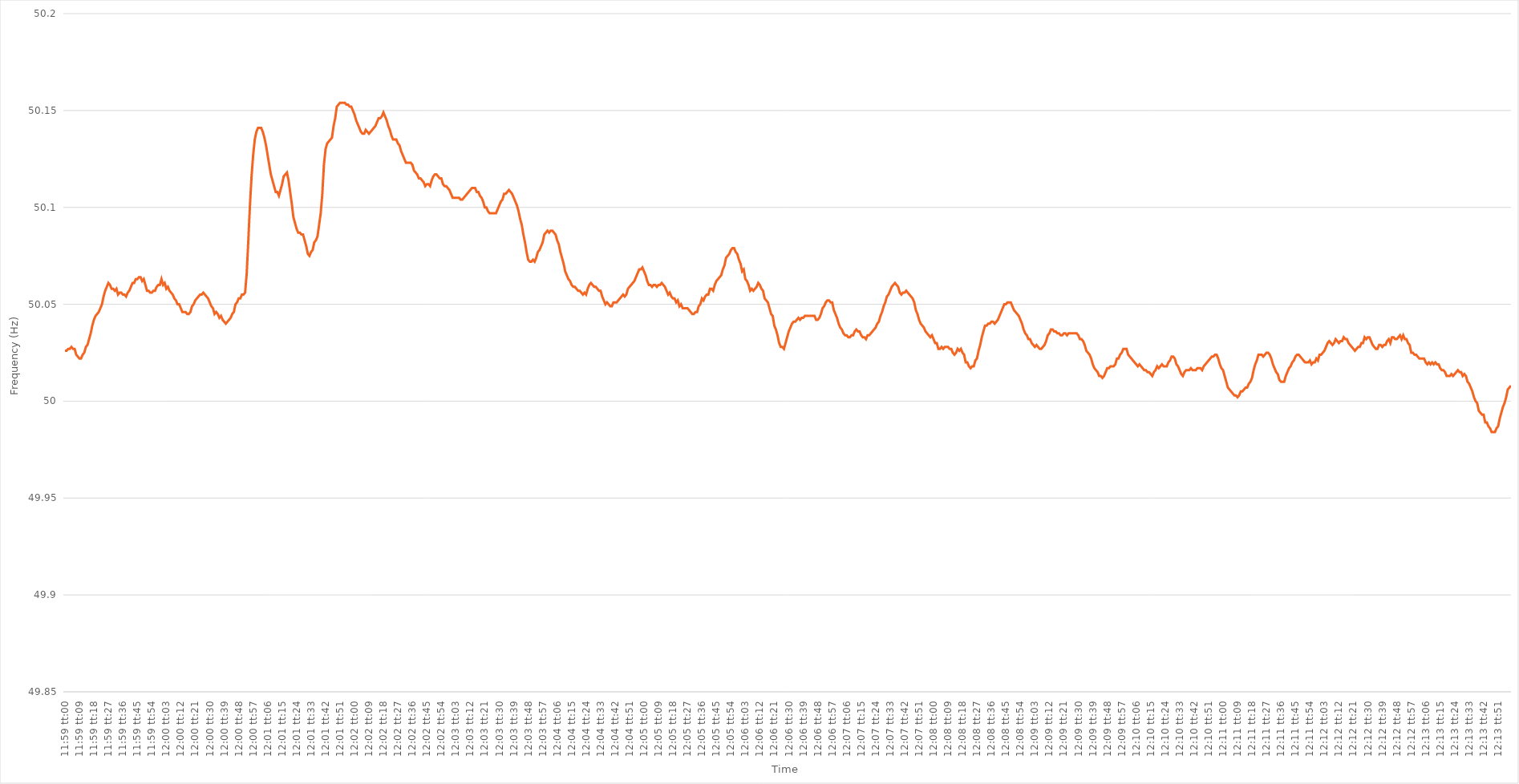
| Category | Series 0 |
|---|---|
| 0.4993055555555555 | 50.026 |
| 0.49931712962962965 | 50.026 |
| 0.4993287037037037 | 50.027 |
| 0.4993402777777778 | 50.027 |
| 0.4993518518518518 | 50.028 |
| 0.4993634259259259 | 50.027 |
| 0.49937499999999996 | 50.027 |
| 0.4993865740740741 | 50.024 |
| 0.49939814814814815 | 50.023 |
| 0.49940972222222224 | 50.022 |
| 0.4994212962962963 | 50.022 |
| 0.4994328703703704 | 50.024 |
| 0.4994444444444444 | 50.025 |
| 0.49945601851851856 | 50.028 |
| 0.4994675925925926 | 50.029 |
| 0.4994791666666667 | 50.032 |
| 0.49949074074074074 | 50.035 |
| 0.49950231481481483 | 50.039 |
| 0.49951388888888887 | 50.042 |
| 0.499525462962963 | 50.044 |
| 0.49953703703703706 | 50.045 |
| 0.4995486111111111 | 50.046 |
| 0.4995601851851852 | 50.048 |
| 0.49957175925925923 | 50.05 |
| 0.4995833333333333 | 50.054 |
| 0.49959490740740736 | 50.057 |
| 0.4996064814814815 | 50.059 |
| 0.49961805555555555 | 50.061 |
| 0.49962962962962965 | 50.06 |
| 0.4996412037037037 | 50.058 |
| 0.4996527777777778 | 50.058 |
| 0.4996643518518518 | 50.057 |
| 0.49967592592592597 | 50.058 |
| 0.4996875 | 50.055 |
| 0.4996990740740741 | 50.056 |
| 0.49971064814814814 | 50.056 |
| 0.49972222222222223 | 50.055 |
| 0.4997337962962963 | 50.055 |
| 0.4997453703703704 | 50.054 |
| 0.49975694444444446 | 50.056 |
| 0.4997685185185185 | 50.057 |
| 0.4997800925925926 | 50.059 |
| 0.49979166666666663 | 50.061 |
| 0.49980324074074073 | 50.061 |
| 0.49981481481481477 | 50.063 |
| 0.4998263888888889 | 50.063 |
| 0.49983796296296296 | 50.064 |
| 0.49984953703703705 | 50.064 |
| 0.4998611111111111 | 50.062 |
| 0.4998726851851852 | 50.063 |
| 0.4998842592592592 | 50.06 |
| 0.4998958333333334 | 50.057 |
| 0.4999074074074074 | 50.057 |
| 0.4999189814814815 | 50.056 |
| 0.49993055555555554 | 50.056 |
| 0.49994212962962964 | 50.057 |
| 0.4999537037037037 | 50.057 |
| 0.49996527777777783 | 50.059 |
| 0.49997685185185187 | 50.06 |
| 0.49998842592592596 | 50.06 |
| 0.5 | 50.063 |
| 0.500011574074074 | 50.06 |
| 0.5000231481481482 | 50.061 |
| 0.5000347222222222 | 50.058 |
| 0.5000462962962963 | 50.059 |
| 0.5000578703703703 | 50.057 |
| 0.5000694444444445 | 50.056 |
| 0.5000810185185185 | 50.055 |
| 0.5000925925925926 | 50.053 |
| 0.5001041666666667 | 50.052 |
| 0.5001157407407407 | 50.05 |
| 0.5001273148148148 | 50.05 |
| 0.5001388888888889 | 50.048 |
| 0.500150462962963 | 50.046 |
| 0.5001620370370371 | 50.046 |
| 0.5001736111111111 | 50.046 |
| 0.5001851851851852 | 50.045 |
| 0.5001967592592592 | 50.045 |
| 0.5002083333333334 | 50.046 |
| 0.5002199074074074 | 50.049 |
| 0.5002314814814816 | 50.05 |
| 0.5002430555555556 | 50.052 |
| 0.5002546296296296 | 50.053 |
| 0.5002662037037037 | 50.054 |
| 0.5002777777777777 | 50.055 |
| 0.5002893518518519 | 50.055 |
| 0.5003009259259259 | 50.056 |
| 0.5003125 | 50.055 |
| 0.5003240740740741 | 50.054 |
| 0.5003356481481481 | 50.053 |
| 0.5003472222222222 | 50.051 |
| 0.5003587962962963 | 50.049 |
| 0.5003703703703704 | 50.048 |
| 0.5003819444444445 | 50.045 |
| 0.5003935185185185 | 50.046 |
| 0.5004050925925926 | 50.045 |
| 0.5004166666666666 | 50.043 |
| 0.5004282407407408 | 50.044 |
| 0.5004398148148148 | 50.042 |
| 0.500451388888889 | 50.041 |
| 0.500462962962963 | 50.04 |
| 0.500474537037037 | 50.041 |
| 0.5004861111111111 | 50.042 |
| 0.5004976851851851 | 50.043 |
| 0.5005092592592593 | 50.045 |
| 0.5005208333333333 | 50.046 |
| 0.5005324074074075 | 50.05 |
| 0.5005439814814815 | 50.051 |
| 0.5005555555555555 | 50.053 |
| 0.5005671296296296 | 50.053 |
| 0.5005787037037037 | 50.055 |
| 0.5005902777777778 | 50.055 |
| 0.5006018518518519 | 50.056 |
| 0.500613425925926 | 50.066 |
| 0.500625 | 50.083 |
| 0.500636574074074 | 50.101 |
| 0.5006481481481482 | 50.116 |
| 0.5006597222222222 | 50.127 |
| 0.5006712962962964 | 50.135 |
| 0.5006828703703704 | 50.139 |
| 0.5006944444444444 | 50.141 |
| 0.5007060185185185 | 50.141 |
| 0.5007175925925925 | 50.141 |
| 0.5007291666666667 | 50.139 |
| 0.5007407407407407 | 50.136 |
| 0.5007523148148149 | 50.132 |
| 0.5007638888888889 | 50.127 |
| 0.5007754629629629 | 50.122 |
| 0.500787037037037 | 50.117 |
| 0.5007986111111111 | 50.114 |
| 0.5008101851851852 | 50.111 |
| 0.5008217592592593 | 50.108 |
| 0.5008333333333334 | 50.108 |
| 0.5008449074074074 | 50.106 |
| 0.5008564814814814 | 50.109 |
| 0.5008680555555556 | 50.112 |
| 0.5008796296296296 | 50.116 |
| 0.5008912037037038 | 50.117 |
| 0.5009027777777778 | 50.118 |
| 0.5009143518518518 | 50.114 |
| 0.5009259259259259 | 50.108 |
| 0.5009375 | 50.102 |
| 0.5009490740740741 | 50.095 |
| 0.5009606481481481 | 50.092 |
| 0.5009722222222223 | 50.089 |
| 0.5009837962962963 | 50.087 |
| 0.5009953703703703 | 50.087 |
| 0.5010069444444444 | 50.086 |
| 0.5010185185185185 | 50.086 |
| 0.5010300925925926 | 50.083 |
| 0.5010416666666667 | 50.08 |
| 0.5010532407407408 | 50.076 |
| 0.5010648148148148 | 50.075 |
| 0.5010763888888888 | 50.077 |
| 0.501087962962963 | 50.078 |
| 0.501099537037037 | 50.082 |
| 0.5011111111111112 | 50.083 |
| 0.5011226851851852 | 50.085 |
| 0.5011342592592593 | 50.091 |
| 0.5011458333333333 | 50.097 |
| 0.5011574074074074 | 50.107 |
| 0.5011689814814815 | 50.122 |
| 0.5011805555555556 | 50.13 |
| 0.5011921296296297 | 50.133 |
| 0.5012037037037037 | 50.134 |
| 0.5012152777777777 | 50.135 |
| 0.5012268518518518 | 50.136 |
| 0.5012384259259259 | 50.142 |
| 0.50125 | 50.146 |
| 0.5012615740740741 | 50.152 |
| 0.5012731481481482 | 50.153 |
| 0.5012847222222222 | 50.154 |
| 0.5012962962962962 | 50.154 |
| 0.5013078703703704 | 50.154 |
| 0.5013194444444444 | 50.154 |
| 0.5013310185185186 | 50.153 |
| 0.5013425925925926 | 50.153 |
| 0.5013541666666667 | 50.152 |
| 0.5013657407407407 | 50.152 |
| 0.5013773148148148 | 50.15 |
| 0.5013888888888889 | 50.148 |
| 0.501400462962963 | 50.145 |
| 0.5014120370370371 | 50.143 |
| 0.5014236111111111 | 50.141 |
| 0.5014351851851852 | 50.139 |
| 0.5014467592592592 | 50.138 |
| 0.5014583333333333 | 50.138 |
| 0.5014699074074074 | 50.14 |
| 0.5014814814814815 | 50.139 |
| 0.5014930555555556 | 50.138 |
| 0.5015046296296296 | 50.139 |
| 0.5015162037037036 | 50.14 |
| 0.5015277777777778 | 50.141 |
| 0.5015393518518518 | 50.142 |
| 0.501550925925926 | 50.144 |
| 0.5015625 | 50.146 |
| 0.5015740740740741 | 50.146 |
| 0.5015856481481481 | 50.147 |
| 0.5015972222222222 | 50.149 |
| 0.5016087962962963 | 50.147 |
| 0.5016203703703704 | 50.145 |
| 0.5016319444444445 | 50.142 |
| 0.5016435185185185 | 50.14 |
| 0.5016550925925926 | 50.137 |
| 0.5016666666666666 | 50.135 |
| 0.5016782407407407 | 50.135 |
| 0.5016898148148148 | 50.135 |
| 0.5017013888888889 | 50.133 |
| 0.501712962962963 | 50.132 |
| 0.501724537037037 | 50.129 |
| 0.501736111111111 | 50.127 |
| 0.5017476851851852 | 50.125 |
| 0.5017592592592592 | 50.123 |
| 0.5017708333333334 | 50.123 |
| 0.5017824074074074 | 50.123 |
| 0.5017939814814815 | 50.123 |
| 0.5018055555555555 | 50.122 |
| 0.5018171296296297 | 50.119 |
| 0.5018287037037037 | 50.118 |
| 0.5018402777777778 | 50.117 |
| 0.5018518518518519 | 50.115 |
| 0.5018634259259259 | 50.115 |
| 0.501875 | 50.114 |
| 0.5018865740740741 | 50.113 |
| 0.5018981481481481 | 50.111 |
| 0.5019097222222222 | 50.112 |
| 0.5019212962962963 | 50.112 |
| 0.5019328703703704 | 50.111 |
| 0.5019444444444444 | 50.114 |
| 0.5019560185185185 | 50.116 |
| 0.5019675925925926 | 50.117 |
| 0.5019791666666666 | 50.117 |
| 0.5019907407407408 | 50.116 |
| 0.5020023148148148 | 50.115 |
| 0.5020138888888889 | 50.115 |
| 0.5020254629629629 | 50.112 |
| 0.5020370370370371 | 50.111 |
| 0.5020486111111111 | 50.111 |
| 0.5020601851851852 | 50.11 |
| 0.5020717592592593 | 50.109 |
| 0.5020833333333333 | 50.107 |
| 0.5020949074074074 | 50.105 |
| 0.5021064814814815 | 50.105 |
| 0.5021180555555556 | 50.105 |
| 0.5021296296296297 | 50.105 |
| 0.5021412037037037 | 50.105 |
| 0.5021527777777778 | 50.104 |
| 0.5021643518518518 | 50.104 |
| 0.5021759259259259 | 50.105 |
| 0.5021875 | 50.106 |
| 0.502199074074074 | 50.107 |
| 0.5022106481481482 | 50.108 |
| 0.5022222222222222 | 50.109 |
| 0.5022337962962963 | 50.11 |
| 0.5022453703703703 | 50.11 |
| 0.5022569444444445 | 50.11 |
| 0.5022685185185185 | 50.108 |
| 0.5022800925925927 | 50.108 |
| 0.5022916666666667 | 50.106 |
| 0.5023032407407407 | 50.105 |
| 0.5023148148148148 | 50.103 |
| 0.5023263888888889 | 50.1 |
| 0.502337962962963 | 50.1 |
| 0.5023495370370371 | 50.098 |
| 0.5023611111111111 | 50.097 |
| 0.5023726851851852 | 50.097 |
| 0.5023842592592592 | 50.097 |
| 0.5023958333333333 | 50.097 |
| 0.5024074074074074 | 50.097 |
| 0.5024189814814815 | 50.099 |
| 0.5024305555555556 | 50.101 |
| 0.5024421296296296 | 50.103 |
| 0.5024537037037037 | 50.104 |
| 0.5024652777777777 | 50.107 |
| 0.5024768518518519 | 50.107 |
| 0.5024884259259259 | 50.108 |
| 0.5025000000000001 | 50.109 |
| 0.5025115740740741 | 50.108 |
| 0.5025231481481481 | 50.107 |
| 0.5025347222222222 | 50.105 |
| 0.5025462962962963 | 50.103 |
| 0.5025578703703704 | 50.101 |
| 0.5025694444444445 | 50.098 |
| 0.5025810185185186 | 50.094 |
| 0.5025925925925926 | 50.091 |
| 0.5026041666666666 | 50.086 |
| 0.5026157407407407 | 50.082 |
| 0.5026273148148148 | 50.077 |
| 0.5026388888888889 | 50.073 |
| 0.502650462962963 | 50.072 |
| 0.502662037037037 | 50.072 |
| 0.5026736111111111 | 50.073 |
| 0.5026851851851851 | 50.072 |
| 0.5026967592592593 | 50.074 |
| 0.5027083333333333 | 50.077 |
| 0.5027199074074075 | 50.078 |
| 0.5027314814814815 | 50.08 |
| 0.5027430555555555 | 50.082 |
| 0.5027546296296296 | 50.086 |
| 0.5027662037037037 | 50.087 |
| 0.5027777777777778 | 50.088 |
| 0.5027893518518519 | 50.087 |
| 0.502800925925926 | 50.088 |
| 0.5028125 | 50.088 |
| 0.502824074074074 | 50.087 |
| 0.5028356481481482 | 50.086 |
| 0.5028472222222222 | 50.083 |
| 0.5028587962962963 | 50.081 |
| 0.5028703703703704 | 50.077 |
| 0.5028819444444445 | 50.074 |
| 0.5028935185185185 | 50.071 |
| 0.5029050925925925 | 50.067 |
| 0.5029166666666667 | 50.065 |
| 0.5029282407407407 | 50.063 |
| 0.5029398148148149 | 50.062 |
| 0.5029513888888889 | 50.06 |
| 0.502962962962963 | 50.059 |
| 0.502974537037037 | 50.059 |
| 0.5029861111111111 | 50.058 |
| 0.5029976851851852 | 50.057 |
| 0.5030092592592593 | 50.057 |
| 0.5030208333333334 | 50.056 |
| 0.5030324074074074 | 50.055 |
| 0.5030439814814814 | 50.056 |
| 0.5030555555555556 | 50.055 |
| 0.5030671296296296 | 50.058 |
| 0.5030787037037037 | 50.06 |
| 0.5030902777777778 | 50.061 |
| 0.5031018518518519 | 50.06 |
| 0.5031134259259259 | 50.059 |
| 0.5031249999999999 | 50.059 |
| 0.5031365740740741 | 50.058 |
| 0.5031481481481481 | 50.057 |
| 0.5031597222222223 | 50.057 |
| 0.5031712962962963 | 50.054 |
| 0.5031828703703703 | 50.052 |
| 0.5031944444444444 | 50.05 |
| 0.5032060185185185 | 50.051 |
| 0.5032175925925926 | 50.05 |
| 0.5032291666666667 | 50.049 |
| 0.5032407407407408 | 50.049 |
| 0.5032523148148148 | 50.051 |
| 0.5032638888888888 | 50.051 |
| 0.503275462962963 | 50.051 |
| 0.503287037037037 | 50.052 |
| 0.5032986111111112 | 50.053 |
| 0.5033101851851852 | 50.054 |
| 0.5033217592592593 | 50.055 |
| 0.5033333333333333 | 50.054 |
| 0.5033449074074073 | 50.055 |
| 0.5033564814814815 | 50.058 |
| 0.5033680555555555 | 50.059 |
| 0.5033796296296297 | 50.06 |
| 0.5033912037037037 | 50.061 |
| 0.5034027777777778 | 50.062 |
| 0.5034143518518518 | 50.064 |
| 0.5034259259259259 | 50.066 |
| 0.5034375 | 50.068 |
| 0.5034490740740741 | 50.068 |
| 0.5034606481481482 | 50.069 |
| 0.5034722222222222 | 50.067 |
| 0.5034837962962962 | 50.065 |
| 0.5034953703703704 | 50.062 |
| 0.5035069444444444 | 50.06 |
| 0.5035185185185186 | 50.06 |
| 0.5035300925925926 | 50.059 |
| 0.5035416666666667 | 50.06 |
| 0.5035532407407407 | 50.06 |
| 0.5035648148148147 | 50.059 |
| 0.5035763888888889 | 50.06 |
| 0.5035879629629629 | 50.06 |
| 0.5035995370370371 | 50.061 |
| 0.5036111111111111 | 50.06 |
| 0.5036226851851852 | 50.059 |
| 0.5036342592592592 | 50.057 |
| 0.5036458333333333 | 50.055 |
| 0.5036574074074074 | 50.056 |
| 0.5036689814814815 | 50.054 |
| 0.5036805555555556 | 50.053 |
| 0.5036921296296296 | 50.053 |
| 0.5037037037037037 | 50.051 |
| 0.5037152777777778 | 50.052 |
| 0.5037268518518518 | 50.049 |
| 0.503738425925926 | 50.05 |
| 0.50375 | 50.048 |
| 0.5037615740740741 | 50.048 |
| 0.5037731481481481 | 50.048 |
| 0.5037847222222223 | 50.048 |
| 0.5037962962962963 | 50.047 |
| 0.5038078703703703 | 50.046 |
| 0.5038194444444445 | 50.045 |
| 0.5038310185185185 | 50.045 |
| 0.5038425925925926 | 50.046 |
| 0.5038541666666666 | 50.046 |
| 0.5038657407407408 | 50.049 |
| 0.5038773148148148 | 50.05 |
| 0.5038888888888889 | 50.053 |
| 0.503900462962963 | 50.052 |
| 0.503912037037037 | 50.054 |
| 0.5039236111111111 | 50.055 |
| 0.5039351851851852 | 50.055 |
| 0.5039467592592592 | 50.058 |
| 0.5039583333333334 | 50.058 |
| 0.5039699074074074 | 50.057 |
| 0.5039814814814815 | 50.06 |
| 0.5039930555555555 | 50.062 |
| 0.5040046296296297 | 50.063 |
| 0.5040162037037037 | 50.064 |
| 0.5040277777777777 | 50.065 |
| 0.5040393518518519 | 50.068 |
| 0.5040509259259259 | 50.07 |
| 0.5040625 | 50.074 |
| 0.504074074074074 | 50.075 |
| 0.5040856481481482 | 50.076 |
| 0.5040972222222222 | 50.078 |
| 0.5041087962962963 | 50.079 |
| 0.5041203703703704 | 50.079 |
| 0.5041319444444444 | 50.077 |
| 0.5041435185185185 | 50.076 |
| 0.5041550925925926 | 50.073 |
| 0.5041666666666667 | 50.071 |
| 0.5041782407407408 | 50.067 |
| 0.5041898148148148 | 50.068 |
| 0.5042013888888889 | 50.063 |
| 0.5042129629629629 | 50.062 |
| 0.5042245370370371 | 50.06 |
| 0.5042361111111111 | 50.057 |
| 0.5042476851851853 | 50.058 |
| 0.5042592592592593 | 50.057 |
| 0.5042708333333333 | 50.058 |
| 0.5042824074074074 | 50.059 |
| 0.5042939814814814 | 50.061 |
| 0.5043055555555556 | 50.06 |
| 0.5043171296296296 | 50.058 |
| 0.5043287037037038 | 50.057 |
| 0.5043402777777778 | 50.053 |
| 0.5043518518518518 | 50.052 |
| 0.5043634259259259 | 50.051 |
| 0.504375 | 50.048 |
| 0.5043865740740741 | 50.045 |
| 0.5043981481481482 | 50.044 |
| 0.5044097222222222 | 50.039 |
| 0.5044212962962963 | 50.037 |
| 0.5044328703703703 | 50.034 |
| 0.5044444444444445 | 50.03 |
| 0.5044560185185185 | 50.028 |
| 0.5044675925925927 | 50.028 |
| 0.5044791666666667 | 50.027 |
| 0.5044907407407407 | 50.03 |
| 0.5045023148148148 | 50.033 |
| 0.5045138888888888 | 50.036 |
| 0.504525462962963 | 50.038 |
| 0.504537037037037 | 50.04 |
| 0.5045486111111112 | 50.041 |
| 0.5045601851851852 | 50.041 |
| 0.5045717592592592 | 50.042 |
| 0.5045833333333333 | 50.043 |
| 0.5045949074074074 | 50.042 |
| 0.5046064814814815 | 50.043 |
| 0.5046180555555556 | 50.043 |
| 0.5046296296296297 | 50.044 |
| 0.5046412037037037 | 50.044 |
| 0.5046527777777777 | 50.044 |
| 0.5046643518518519 | 50.044 |
| 0.5046759259259259 | 50.044 |
| 0.5046875000000001 | 50.044 |
| 0.5046990740740741 | 50.044 |
| 0.5047106481481481 | 50.042 |
| 0.5047222222222222 | 50.042 |
| 0.5047337962962963 | 50.043 |
| 0.5047453703703704 | 50.045 |
| 0.5047569444444444 | 50.048 |
| 0.5047685185185186 | 50.049 |
| 0.5047800925925926 | 50.051 |
| 0.5047916666666666 | 50.052 |
| 0.5048032407407407 | 50.052 |
| 0.5048148148148148 | 50.051 |
| 0.5048263888888889 | 50.051 |
| 0.504837962962963 | 50.047 |
| 0.504849537037037 | 50.045 |
| 0.5048611111111111 | 50.043 |
| 0.5048726851851851 | 50.04 |
| 0.5048842592592593 | 50.038 |
| 0.5048958333333333 | 50.037 |
| 0.5049074074074075 | 50.035 |
| 0.5049189814814815 | 50.034 |
| 0.5049305555555555 | 50.034 |
| 0.5049421296296296 | 50.033 |
| 0.5049537037037037 | 50.033 |
| 0.5049652777777778 | 50.034 |
| 0.5049768518518518 | 50.034 |
| 0.504988425925926 | 50.036 |
| 0.505 | 50.037 |
| 0.505011574074074 | 50.036 |
| 0.5050231481481481 | 50.036 |
| 0.5050347222222222 | 50.034 |
| 0.5050462962962963 | 50.033 |
| 0.5050578703703704 | 50.033 |
| 0.5050694444444445 | 50.032 |
| 0.5050810185185185 | 50.034 |
| 0.5050925925925925 | 50.034 |
| 0.5051041666666667 | 50.035 |
| 0.5051157407407407 | 50.036 |
| 0.5051273148148149 | 50.037 |
| 0.5051388888888889 | 50.038 |
| 0.505150462962963 | 50.04 |
| 0.505162037037037 | 50.041 |
| 0.5051736111111111 | 50.044 |
| 0.5051851851851852 | 50.046 |
| 0.5051967592592593 | 50.049 |
| 0.5052083333333334 | 50.051 |
| 0.5052199074074074 | 50.054 |
| 0.5052314814814814 | 50.055 |
| 0.5052430555555555 | 50.057 |
| 0.5052546296296296 | 50.059 |
| 0.5052662037037037 | 50.06 |
| 0.5052777777777778 | 50.061 |
| 0.5052893518518519 | 50.06 |
| 0.5053009259259259 | 50.059 |
| 0.5053124999999999 | 50.056 |
| 0.5053240740740741 | 50.055 |
| 0.5053356481481481 | 50.056 |
| 0.5053472222222223 | 50.056 |
| 0.5053587962962963 | 50.057 |
| 0.5053703703703704 | 50.056 |
| 0.5053819444444444 | 50.055 |
| 0.5053935185185185 | 50.054 |
| 0.5054050925925926 | 50.053 |
| 0.5054166666666667 | 50.051 |
| 0.5054282407407408 | 50.047 |
| 0.5054398148148148 | 50.045 |
| 0.5054513888888889 | 50.042 |
| 0.5054629629629629 | 50.04 |
| 0.505474537037037 | 50.039 |
| 0.5054861111111111 | 50.038 |
| 0.5054976851851852 | 50.036 |
| 0.5055092592592593 | 50.035 |
| 0.5055208333333333 | 50.034 |
| 0.5055324074074073 | 50.033 |
| 0.5055439814814815 | 50.034 |
| 0.5055555555555555 | 50.032 |
| 0.5055671296296297 | 50.03 |
| 0.5055787037037037 | 50.03 |
| 0.5055902777777778 | 50.027 |
| 0.5056018518518518 | 50.027 |
| 0.505613425925926 | 50.028 |
| 0.505625 | 50.027 |
| 0.5056365740740741 | 50.028 |
| 0.5056481481481482 | 50.028 |
| 0.5056597222222222 | 50.028 |
| 0.5056712962962963 | 50.027 |
| 0.5056828703703703 | 50.027 |
| 0.5056944444444444 | 50.025 |
| 0.5057060185185185 | 50.024 |
| 0.5057175925925926 | 50.025 |
| 0.5057291666666667 | 50.027 |
| 0.5057407407407407 | 50.026 |
| 0.5057523148148148 | 50.027 |
| 0.5057638888888889 | 50.025 |
| 0.5057754629629629 | 50.024 |
| 0.5057870370370371 | 50.02 |
| 0.5057986111111111 | 50.02 |
| 0.5058101851851852 | 50.018 |
| 0.5058217592592592 | 50.017 |
| 0.5058333333333334 | 50.018 |
| 0.5058449074074074 | 50.018 |
| 0.5058564814814815 | 50.021 |
| 0.5058680555555556 | 50.022 |
| 0.5058796296296296 | 50.026 |
| 0.5058912037037037 | 50.029 |
| 0.5059027777777778 | 50.033 |
| 0.5059143518518519 | 50.036 |
| 0.5059259259259259 | 50.039 |
| 0.5059375 | 50.039 |
| 0.5059490740740741 | 50.04 |
| 0.5059606481481481 | 50.04 |
| 0.5059722222222222 | 50.041 |
| 0.5059837962962963 | 50.041 |
| 0.5059953703703703 | 50.04 |
| 0.5060069444444445 | 50.041 |
| 0.5060185185185185 | 50.042 |
| 0.5060300925925926 | 50.044 |
| 0.5060416666666666 | 50.046 |
| 0.5060532407407408 | 50.048 |
| 0.5060648148148148 | 50.05 |
| 0.506076388888889 | 50.05 |
| 0.506087962962963 | 50.051 |
| 0.506099537037037 | 50.051 |
| 0.5061111111111111 | 50.051 |
| 0.5061226851851852 | 50.049 |
| 0.5061342592592593 | 50.047 |
| 0.5061458333333334 | 50.046 |
| 0.5061574074074074 | 50.045 |
| 0.5061689814814815 | 50.044 |
| 0.5061805555555555 | 50.042 |
| 0.5061921296296296 | 50.04 |
| 0.5062037037037037 | 50.037 |
| 0.5062152777777778 | 50.035 |
| 0.5062268518518519 | 50.034 |
| 0.5062384259259259 | 50.032 |
| 0.50625 | 50.032 |
| 0.506261574074074 | 50.03 |
| 0.5062731481481482 | 50.029 |
| 0.5062847222222222 | 50.028 |
| 0.5062962962962964 | 50.029 |
| 0.5063078703703704 | 50.028 |
| 0.5063194444444444 | 50.027 |
| 0.5063310185185185 | 50.027 |
| 0.5063425925925926 | 50.028 |
| 0.5063541666666667 | 50.029 |
| 0.5063657407407408 | 50.031 |
| 0.5063773148148148 | 50.034 |
| 0.5063888888888889 | 50.035 |
| 0.5064004629629629 | 50.037 |
| 0.506412037037037 | 50.037 |
| 0.5064236111111111 | 50.036 |
| 0.5064351851851852 | 50.036 |
| 0.5064467592592593 | 50.035 |
| 0.5064583333333333 | 50.035 |
| 0.5064699074074074 | 50.034 |
| 0.5064814814814814 | 50.034 |
| 0.5064930555555556 | 50.035 |
| 0.5065046296296296 | 50.035 |
| 0.5065162037037038 | 50.034 |
| 0.5065277777777778 | 50.035 |
| 0.5065393518518518 | 50.035 |
| 0.5065509259259259 | 50.035 |
| 0.5065625 | 50.035 |
| 0.5065740740740741 | 50.035 |
| 0.5065856481481482 | 50.035 |
| 0.5065972222222223 | 50.034 |
| 0.5066087962962963 | 50.032 |
| 0.5066203703703703 | 50.032 |
| 0.5066319444444445 | 50.031 |
| 0.5066435185185185 | 50.029 |
| 0.5066550925925926 | 50.026 |
| 0.5066666666666667 | 50.025 |
| 0.5066782407407407 | 50.024 |
| 0.5066898148148148 | 50.022 |
| 0.5067013888888888 | 50.019 |
| 0.506712962962963 | 50.017 |
| 0.506724537037037 | 50.016 |
| 0.5067361111111112 | 50.015 |
| 0.5067476851851852 | 50.013 |
| 0.5067592592592592 | 50.013 |
| 0.5067708333333333 | 50.012 |
| 0.5067824074074074 | 50.013 |
| 0.5067939814814815 | 50.015 |
| 0.5068055555555556 | 50.017 |
| 0.5068171296296297 | 50.017 |
| 0.5068287037037037 | 50.018 |
| 0.5068402777777777 | 50.018 |
| 0.5068518518518519 | 50.018 |
| 0.5068634259259259 | 50.019 |
| 0.506875 | 50.022 |
| 0.5068865740740741 | 50.022 |
| 0.5068981481481482 | 50.024 |
| 0.5069097222222222 | 50.025 |
| 0.5069212962962962 | 50.027 |
| 0.5069328703703704 | 50.027 |
| 0.5069444444444444 | 50.027 |
| 0.5069560185185186 | 50.024 |
| 0.5069675925925926 | 50.023 |
| 0.5069791666666666 | 50.022 |
| 0.5069907407407407 | 50.021 |
| 0.5070023148148148 | 50.02 |
| 0.5070138888888889 | 50.019 |
| 0.507025462962963 | 50.018 |
| 0.5070370370370371 | 50.019 |
| 0.5070486111111111 | 50.018 |
| 0.5070601851851851 | 50.017 |
| 0.5070717592592593 | 50.016 |
| 0.5070833333333333 | 50.016 |
| 0.5070949074074075 | 50.015 |
| 0.5071064814814815 | 50.015 |
| 0.5071180555555556 | 50.014 |
| 0.5071296296296296 | 50.013 |
| 0.5071412037037036 | 50.015 |
| 0.5071527777777778 | 50.016 |
| 0.5071643518518518 | 50.018 |
| 0.507175925925926 | 50.017 |
| 0.5071875 | 50.018 |
| 0.507199074074074 | 50.019 |
| 0.5072106481481481 | 50.018 |
| 0.5072222222222222 | 50.018 |
| 0.5072337962962963 | 50.018 |
| 0.5072453703703704 | 50.02 |
| 0.5072569444444445 | 50.021 |
| 0.5072685185185185 | 50.023 |
| 0.5072800925925925 | 50.023 |
| 0.5072916666666667 | 50.022 |
| 0.5073032407407407 | 50.019 |
| 0.5073148148148149 | 50.018 |
| 0.5073263888888889 | 50.016 |
| 0.507337962962963 | 50.014 |
| 0.507349537037037 | 50.013 |
| 0.507361111111111 | 50.015 |
| 0.5073726851851852 | 50.016 |
| 0.5073842592592592 | 50.016 |
| 0.5073958333333334 | 50.016 |
| 0.5074074074074074 | 50.017 |
| 0.5074189814814815 | 50.016 |
| 0.5074305555555555 | 50.016 |
| 0.5074421296296296 | 50.016 |
| 0.5074537037037037 | 50.017 |
| 0.5074652777777778 | 50.017 |
| 0.5074768518518519 | 50.017 |
| 0.5074884259259259 | 50.016 |
| 0.5075 | 50.018 |
| 0.5075115740740741 | 50.019 |
| 0.5075231481481481 | 50.02 |
| 0.5075347222222223 | 50.021 |
| 0.5075462962962963 | 50.022 |
| 0.5075578703703704 | 50.023 |
| 0.5075694444444444 | 50.023 |
| 0.5075810185185184 | 50.024 |
| 0.5075925925925926 | 50.024 |
| 0.5076041666666666 | 50.022 |
| 0.5076157407407408 | 50.019 |
| 0.5076273148148148 | 50.017 |
| 0.5076388888888889 | 50.016 |
| 0.5076504629629629 | 50.013 |
| 0.507662037037037 | 50.01 |
| 0.5076736111111111 | 50.007 |
| 0.5076851851851852 | 50.006 |
| 0.5076967592592593 | 50.005 |
| 0.5077083333333333 | 50.004 |
| 0.5077199074074074 | 50.003 |
| 0.5077314814814815 | 50.003 |
| 0.5077430555555555 | 50.002 |
| 0.5077546296296297 | 50.003 |
| 0.5077662037037037 | 50.005 |
| 0.5077777777777778 | 50.005 |
| 0.5077893518518518 | 50.006 |
| 0.507800925925926 | 50.007 |
| 0.5078125 | 50.007 |
| 0.507824074074074 | 50.009 |
| 0.5078356481481482 | 50.01 |
| 0.5078472222222222 | 50.012 |
| 0.5078587962962963 | 50.016 |
| 0.5078703703703703 | 50.019 |
| 0.5078819444444445 | 50.021 |
| 0.5078935185185185 | 50.024 |
| 0.5079050925925926 | 50.024 |
| 0.5079166666666667 | 50.024 |
| 0.5079282407407407 | 50.023 |
| 0.5079398148148148 | 50.024 |
| 0.5079513888888889 | 50.025 |
| 0.507962962962963 | 50.025 |
| 0.5079745370370371 | 50.024 |
| 0.5079861111111111 | 50.022 |
| 0.5079976851851852 | 50.019 |
| 0.5080092592592592 | 50.017 |
| 0.5080208333333334 | 50.015 |
| 0.5080324074074074 | 50.014 |
| 0.5080439814814816 | 50.011 |
| 0.5080555555555556 | 50.01 |
| 0.5080671296296296 | 50.01 |
| 0.5080787037037037 | 50.01 |
| 0.5080902777777777 | 50.013 |
| 0.5081018518518519 | 50.015 |
| 0.5081134259259259 | 50.017 |
| 0.508125 | 50.018 |
| 0.5081365740740741 | 50.02 |
| 0.5081481481481481 | 50.021 |
| 0.5081597222222222 | 50.023 |
| 0.5081712962962963 | 50.024 |
| 0.5081828703703704 | 50.024 |
| 0.5081944444444445 | 50.023 |
| 0.5082060185185185 | 50.022 |
| 0.5082175925925926 | 50.021 |
| 0.5082291666666666 | 50.02 |
| 0.5082407407407408 | 50.02 |
| 0.5082523148148148 | 50.02 |
| 0.508263888888889 | 50.021 |
| 0.508275462962963 | 50.019 |
| 0.508287037037037 | 50.02 |
| 0.5082986111111111 | 50.02 |
| 0.5083101851851851 | 50.022 |
| 0.5083217592592593 | 50.021 |
| 0.5083333333333333 | 50.024 |
| 0.5083449074074075 | 50.024 |
| 0.5083564814814815 | 50.025 |
| 0.5083680555555555 | 50.026 |
| 0.5083796296296296 | 50.028 |
| 0.5083912037037037 | 50.03 |
| 0.5084027777777778 | 50.031 |
| 0.5084143518518519 | 50.03 |
| 0.508425925925926 | 50.029 |
| 0.5084375 | 50.03 |
| 0.508449074074074 | 50.032 |
| 0.5084606481481482 | 50.031 |
| 0.5084722222222222 | 50.03 |
| 0.5084837962962964 | 50.031 |
| 0.5084953703703704 | 50.031 |
| 0.5085069444444444 | 50.033 |
| 0.5085185185185185 | 50.032 |
| 0.5085300925925925 | 50.032 |
| 0.5085416666666667 | 50.03 |
| 0.5085532407407407 | 50.029 |
| 0.5085648148148149 | 50.028 |
| 0.5085763888888889 | 50.027 |
| 0.5085879629629629 | 50.026 |
| 0.508599537037037 | 50.027 |
| 0.5086111111111111 | 50.028 |
| 0.5086226851851852 | 50.028 |
| 0.5086342592592593 | 50.03 |
| 0.5086458333333334 | 50.03 |
| 0.5086574074074074 | 50.033 |
| 0.5086689814814814 | 50.032 |
| 0.5086805555555556 | 50.033 |
| 0.5086921296296296 | 50.033 |
| 0.5087037037037038 | 50.031 |
| 0.5087152777777778 | 50.029 |
| 0.5087268518518518 | 50.028 |
| 0.5087384259259259 | 50.027 |
| 0.50875 | 50.027 |
| 0.5087615740740741 | 50.029 |
| 0.5087731481481481 | 50.029 |
| 0.5087847222222223 | 50.028 |
| 0.5087962962962963 | 50.029 |
| 0.5088078703703703 | 50.029 |
| 0.5088194444444444 | 50.031 |
| 0.5088310185185185 | 50.032 |
| 0.5088425925925926 | 50.03 |
| 0.5088541666666667 | 50.033 |
| 0.5088657407407408 | 50.033 |
| 0.5088773148148148 | 50.032 |
| 0.5088888888888888 | 50.032 |
| 0.508900462962963 | 50.033 |
| 0.508912037037037 | 50.034 |
| 0.5089236111111112 | 50.032 |
| 0.5089351851851852 | 50.034 |
| 0.5089467592592593 | 50.032 |
| 0.5089583333333333 | 50.032 |
| 0.5089699074074074 | 50.03 |
| 0.5089814814814815 | 50.029 |
| 0.5089930555555555 | 50.025 |
| 0.5090046296296297 | 50.025 |
| 0.5090162037037037 | 50.024 |
| 0.5090277777777777 | 50.024 |
| 0.5090393518518518 | 50.023 |
| 0.5090509259259259 | 50.022 |
| 0.5090625 | 50.022 |
| 0.5090740740740741 | 50.022 |
| 0.5090856481481482 | 50.022 |
| 0.5090972222222222 | 50.02 |
| 0.5091087962962962 | 50.019 |
| 0.5091203703703704 | 50.02 |
| 0.5091319444444444 | 50.019 |
| 0.5091435185185186 | 50.02 |
| 0.5091550925925926 | 50.019 |
| 0.5091666666666667 | 50.02 |
| 0.5091782407407407 | 50.019 |
| 0.5091898148148148 | 50.019 |
| 0.5092013888888889 | 50.017 |
| 0.509212962962963 | 50.016 |
| 0.5092245370370371 | 50.016 |
| 0.5092361111111111 | 50.015 |
| 0.5092476851851852 | 50.013 |
| 0.5092592592592592 | 50.013 |
| 0.5092708333333333 | 50.013 |
| 0.5092824074074074 | 50.014 |
| 0.5092939814814815 | 50.013 |
| 0.5093055555555556 | 50.014 |
| 0.5093171296296296 | 50.015 |
| 0.5093287037037036 | 50.016 |
| 0.5093402777777778 | 50.015 |
| 0.5093518518518518 | 50.015 |
| 0.509363425925926 | 50.013 |
| 0.509375 | 50.014 |
| 0.5093865740740741 | 50.013 |
| 0.5093981481481481 | 50.01 |
| 0.5094097222222222 | 50.009 |
| 0.5094212962962963 | 50.007 |
| 0.5094328703703704 | 50.005 |
| 0.5094444444444445 | 50.002 |
| 0.5094560185185185 | 50 |
| 0.5094675925925926 | 49.999 |
| 0.5094791666666666 | 49.995 |
| 0.5094907407407407 | 49.994 |
| 0.5095023148148148 | 49.993 |
| 0.5095138888888889 | 49.993 |
| 0.509525462962963 | 49.989 |
| 0.509537037037037 | 49.989 |
| 0.509548611111111 | 49.987 |
| 0.5095601851851852 | 49.986 |
| 0.5095717592592592 | 49.984 |
| 0.5095833333333334 | 49.984 |
| 0.5095949074074074 | 49.984 |
| 0.5096064814814815 | 49.986 |
| 0.5096180555555555 | 49.987 |
| 0.5096296296296297 | 49.991 |
| 0.5096412037037037 | 49.994 |
| 0.5096527777777778 | 49.997 |
| 0.5096643518518519 | 49.999 |
| 0.5096759259259259 | 50.002 |
| 0.5096875 | 50.006 |
| 0.5096990740740741 | 50.007 |
| 0.5097106481481481 | 50.008 |